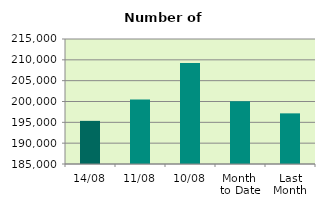
| Category | Series 0 |
|---|---|
| 14/08 | 195352 |
| 11/08 | 200454 |
| 10/08 | 209264 |
| Month 
to Date | 200043.8 |
| Last
Month | 197154 |